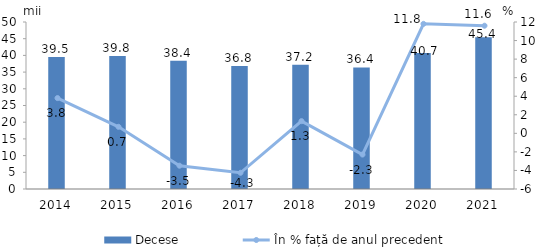
| Category | Decese |
|---|---|
| 2014.0 | 39.5 |
| 2015.0 | 39.8 |
| 2016.0 | 38.4 |
| 2017.0 | 36.8 |
| 2018.0 | 37.2 |
| 2019.0 | 36.4 |
| 2020.0 | 40.7 |
| 2021.0 | 45.4 |